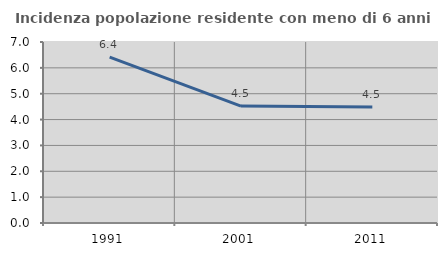
| Category | Incidenza popolazione residente con meno di 6 anni |
|---|---|
| 1991.0 | 6.412 |
| 2001.0 | 4.521 |
| 2011.0 | 4.483 |